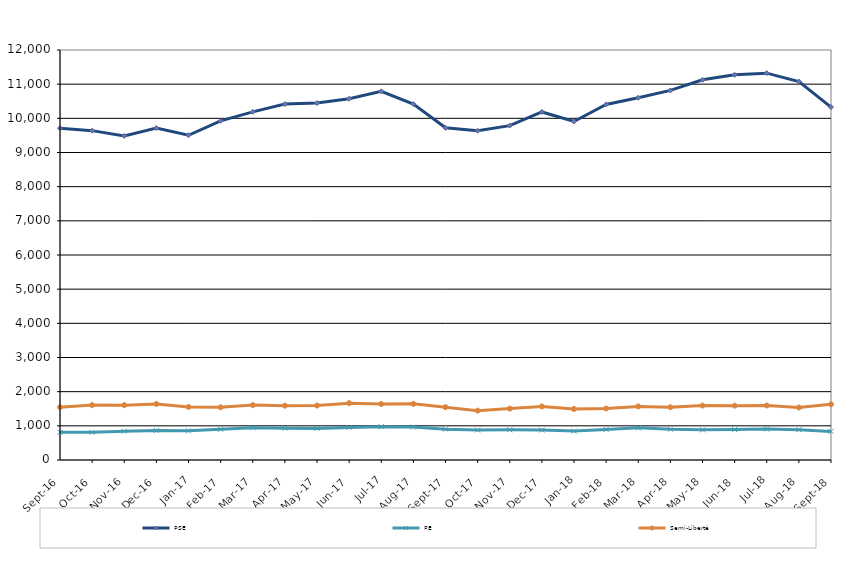
| Category | PSE | PE | Semi-Liberté |
|---|---|---|---|
| 2016-09-01 | 9712 | 813 | 1546 |
| 2016-10-01 | 9640 | 809 | 1607 |
| 2016-11-01 | 9484 | 844 | 1605 |
| 2016-12-01 | 9714 | 866 | 1641 |
| 2017-01-01 | 9505 | 855 | 1553 |
| 2017-02-01 | 9927 | 900 | 1542 |
| 2017-03-01 | 10190 | 942 | 1607 |
| 2017-04-01 | 10417 | 931 | 1590 |
| 2017-05-01 | 10448 | 924 | 1594 |
| 2017-06-01 | 10575 | 951 | 1664 |
| 2017-07-01 | 10791 | 974 | 1639 |
| 2017-08-01 | 10417 | 963 | 1644 |
| 2017-09-01 | 9723 | 903 | 1547 |
| 2017-10-01 | 9637 | 879 | 1445 |
| 2017-11-01 | 9787 | 885 | 1504 |
| 2017-12-01 | 10187 | 876 | 1568 |
| 2018-01-01 | 9907 | 847 | 1493 |
| 2018-02-01 | 10406 | 895 | 1508 |
| 2018-03-01 | 10603 | 942 | 1569 |
| 2018-04-01 | 10817 | 901 | 1544 |
| 2018-05-01 | 11127 | 882 | 1594 |
| 2018-06-01 | 11275 | 890 | 1591 |
| 2018-07-01 | 11322 | 905 | 1596 |
| 2018-08-01 | 11075 | 888 | 1537 |
| 2018-09-01 | 10329 | 837 | 1630 |